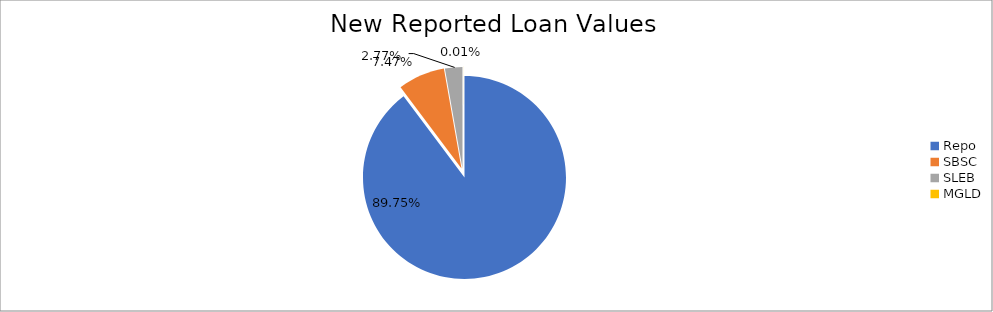
| Category | Series 0 |
|---|---|
| Repo | 12132571.586 |
| SBSC | 1009411.326 |
| SLEB | 374713.978 |
| MGLD | 891.219 |